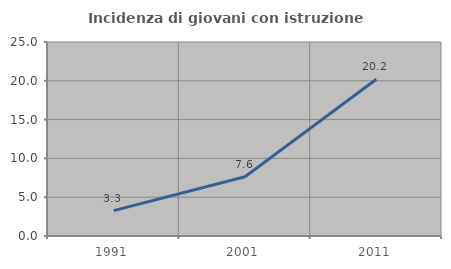
| Category | Incidenza di giovani con istruzione universitaria |
|---|---|
| 1991.0 | 3.274 |
| 2001.0 | 7.635 |
| 2011.0 | 20.205 |